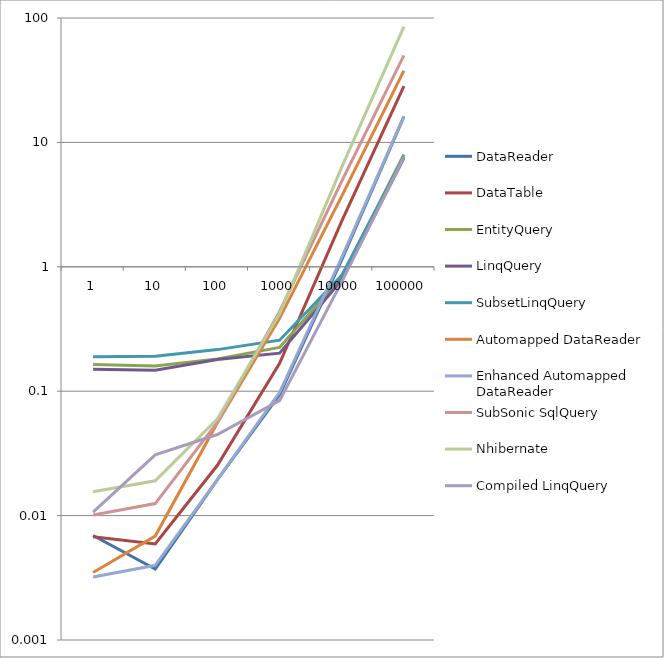
| Category | DataReader | DataTable | EntityQuery | LinqQuery | SubsetLinqQuery | Automapped DataReader | Enhanced Automapped DataReader | SubSonic SqlQuery | Nhibernate | Compiled LinqQuery |
|---|---|---|---|---|---|---|---|---|---|---|
| 1.0 | 0.007 | 0.007 | 0.164 | 0.15 | 0.19 | 0.003 | 0.003 | 0.01 | 0.016 | 0.011 |
| 10.0 | 0.004 | 0.006 | 0.159 | 0.147 | 0.191 | 0.007 | 0.004 | 0.012 | 0.019 | 0.031 |
| 100.0 | 0.019 | 0.025 | 0.182 | 0.18 | 0.216 | 0.056 | 0.019 | 0.056 | 0.06 | 0.045 |
| 1000.0 | 0.093 | 0.168 | 0.225 | 0.202 | 0.257 | 0.385 | 0.098 | 0.437 | 0.419 | 0.084 |
| 10000.0 | 1.139 | 2.328 | 0.829 | 0.782 | 0.854 | 3.697 | 1.191 | 4.878 | 6.33 | 0.757 |
| 100000.0 | 16.114 | 28.303 | 7.992 | 7.467 | 7.711 | 37.754 | 16.261 | 50.131 | 85.403 | 7.62 |